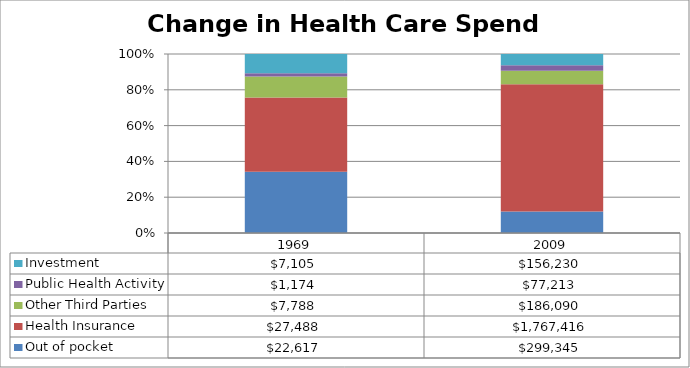
| Category | Out of pocket | Health Insurance | Other Third Parties | Public Health Activity | Investment |
|---|---|---|---|---|---|
| 1969.0 | 22616.6 | 27488.3 | 7788.3 | 1173.8 | 7105.1 |
| 2009.0 | 299344.9 | 1767416.3 | 186089.6 | 77213 | 156229.5 |